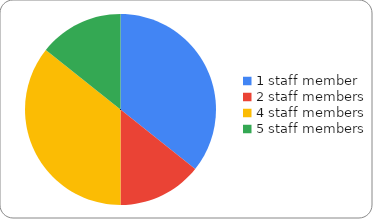
| Category | Series 0 |
|---|---|
| 1 staff member | 5 |
| 2 staff members | 2 |
| 4 staff members | 5 |
| 5 staff members | 2 |